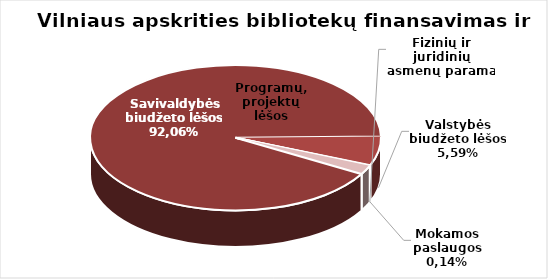
| Category | Series 0 |
|---|---|
| Savivaldybės biudžeto lėšos | 7224453.7 |
| Valstybės biudžeto lėšos | 509157 |
| Mokamos paslaugos | 7810.98 |
| Fizinių ir juridinių asmenų parama | 3548 |
| Programų, projektų lėšos | 160006.68 |